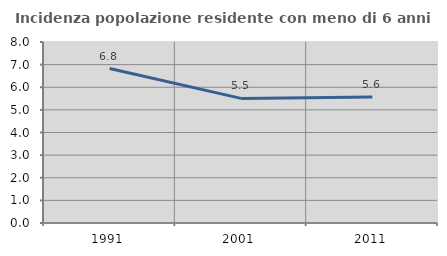
| Category | Incidenza popolazione residente con meno di 6 anni |
|---|---|
| 1991.0 | 6.826 |
| 2001.0 | 5.508 |
| 2011.0 | 5.574 |